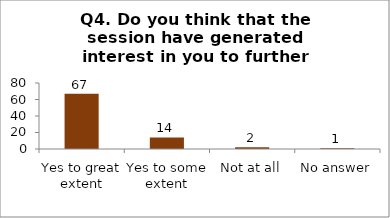
| Category | Q4. Do you think that the session have generated interest in you to further explore the topics? |
|---|---|
| Yes to great extent | 67 |
| Yes to some extent | 14 |
| Not at all | 2 |
| No answer | 1 |